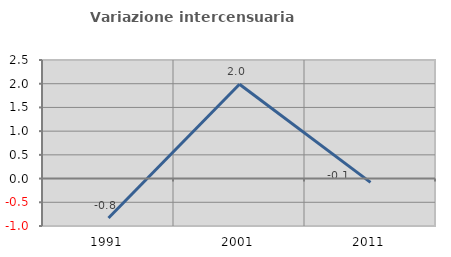
| Category | Variazione intercensuaria annua |
|---|---|
| 1991.0 | -0.832 |
| 2001.0 | 1.99 |
| 2011.0 | -0.08 |